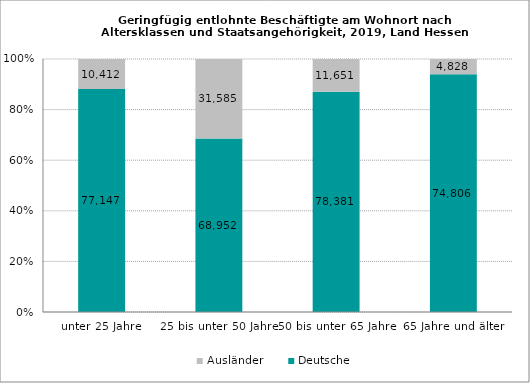
| Category | Deutsche | Ausländer |
|---|---|---|
| unter 25 Jahre | 77147 | 10412 |
| 25 bis unter 50 Jahre | 68952 | 31585 |
| 50 bis unter 65 Jahre | 78381 | 11651 |
| 65 Jahre und älter | 74806 | 4828 |